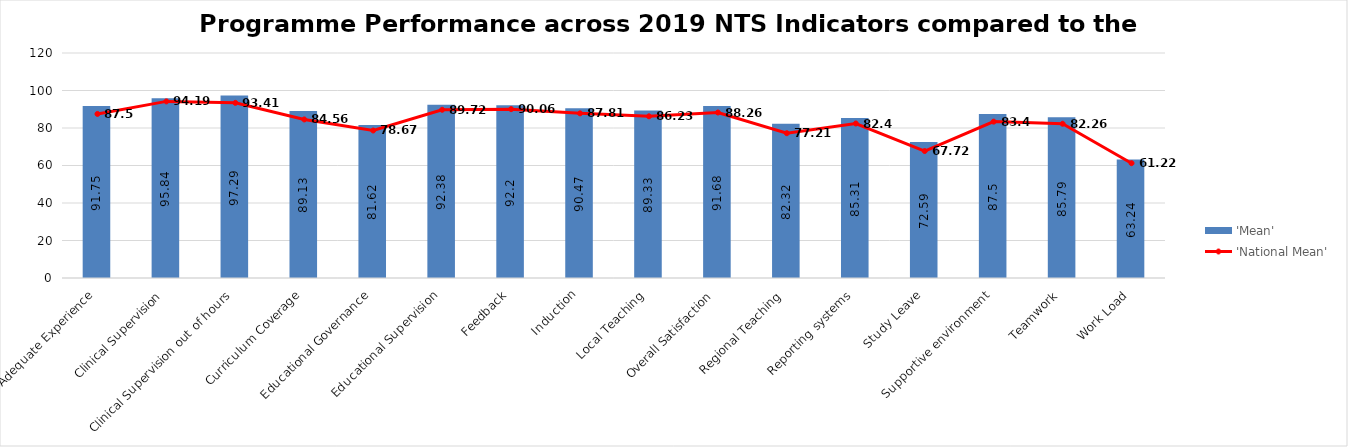
| Category | 'Mean' |
|---|---|
| Adequate Experience | 91.75 |
| Clinical Supervision | 95.84 |
| Clinical Supervision out of hours | 97.29 |
| Curriculum Coverage | 89.13 |
| Educational Governance | 81.62 |
| Educational Supervision | 92.38 |
| Feedback | 92.2 |
| Induction | 90.47 |
| Local Teaching | 89.33 |
| Overall Satisfaction | 91.68 |
| Regional Teaching | 82.32 |
| Reporting systems | 85.31 |
| Study Leave | 72.59 |
| Supportive environment | 87.5 |
| Teamwork | 85.79 |
| Work Load | 63.24 |